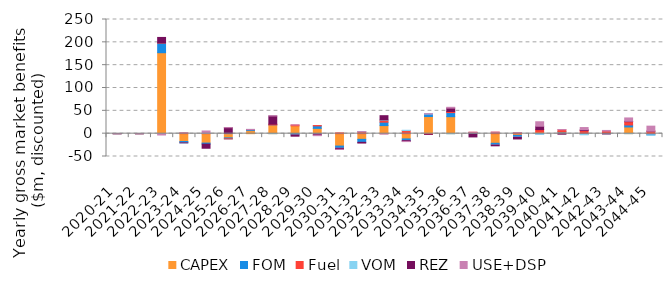
| Category | CAPEX | FOM | Fuel | VOM | REZ | USE+DSP |
|---|---|---|---|---|---|---|
| 2020-21 | 0 | 0 | 0 | 0 | 0 | 0 |
| 2021-22 | 0 | 0 | -0.078 | 0.005 | 0 | 0 |
| 2022-23 | 177.272 | 21.073 | 0.63 | -0.37 | 11.736 | -2.532 |
| 2023-24 | -17.191 | -2.603 | 1.708 | -0.233 | 0 | 0.283 |
| 2024-25 | -20.632 | -2.307 | 0.62 | 0.355 | -8.98 | 4.883 |
| 2025-26 | -9.243 | -2.041 | -0.167 | 0.222 | 12.917 | 0 |
| 2026-27 | 6.789 | 1.9 | 0.26 | 0.253 | 0 | 0 |
| 2027-28 | 19.22 | 0.029 | 1.521 | -0.088 | 17.985 | 0 |
| 2028-29 | 17.138 | -2.267 | 1.814 | -0.475 | -2.775 | 0.275 |
| 2029-30 | 11.606 | 5.416 | 0.751 | -0.554 | -2.53 | -1.291 |
| 2030-31 | -27.187 | -4.606 | 1.757 | -0.069 | -2.45 | -0.022 |
| 2031-32 | -12.426 | -6.538 | 4.367 | 0.134 | -1.59 | 0.018 |
| 2032-33 | 17.704 | 7.485 | 4.207 | 0.828 | 9.151 | -1.056 |
| 2033-34 | -11.51 | -3.604 | 6.836 | 0.612 | -1.7 | -0.523 |
| 2034-35 | 37.509 | 5.574 | -1.371 | 0.05 | 0 | 0.564 |
| 2035-36 | 37.156 | 9.018 | 2.452 | -0.376 | 7.335 | 1.774 |
| 2036-37 | 1.898 | 0.446 | 0.754 | -0.445 | -6.675 | 0 |
| 2037-38 | -21.068 | -3.464 | 3.3 | -0.281 | -1.789 | 0 |
| 2038-39 | -3.678 | -3.598 | 2.312 | -0.5 | -3.82 | 0.003 |
| 2039-40 | 3.493 | -0.549 | 5.428 | -0.299 | 7.351 | 9.793 |
| 2040-41 | 3.433 | 0.796 | 4.295 | -0.153 | -0.904 | 0.437 |
| 2041-42 | -1.748 | 0.736 | 6.025 | -0.698 | 1.816 | 4.82 |
| 2042-43 | 0.187 | 0.015 | 5.475 | -0.435 | 0 | 1.369 |
| 2043-44 | 14.69 | 4.347 | 7.262 | 0 | 0.935 | 7.197 |
| 2044-45 | -1.379 | -1.438 | 5.508 | -0.353 | 0.005 | 10.951 |